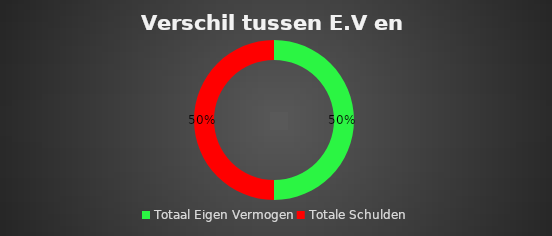
| Category | Series 1 |
|---|---|
| Totaal Eigen Vermogen | 6000 |
| Totale Schulden | 6000 |